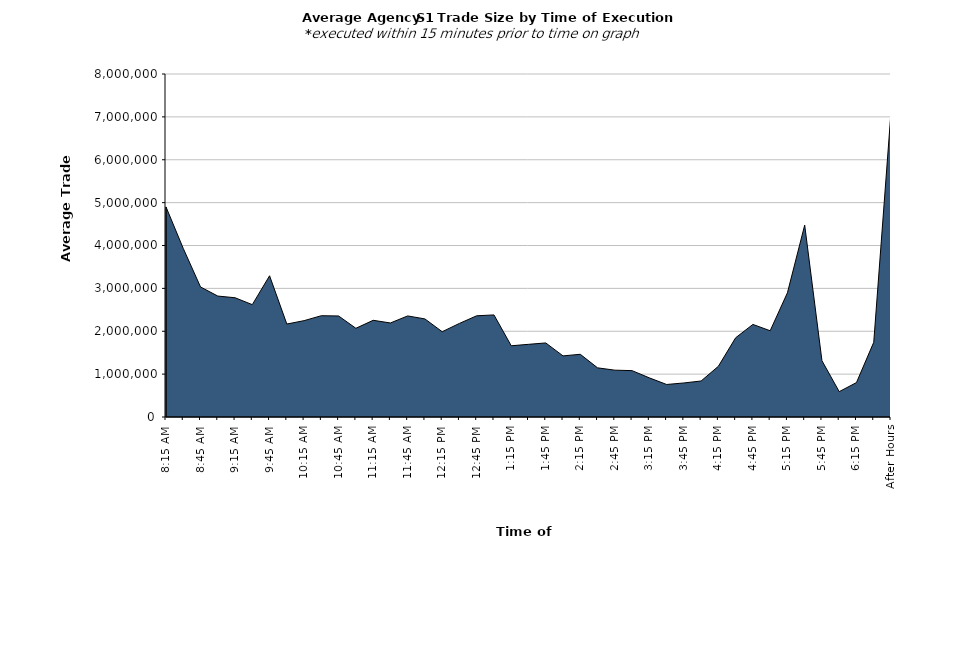
| Category | Series 0 |
|---|---|
| 8:15 AM | 4899503.876 |
| 8:30 AM | 3931654.894 |
| 8:45 AM | 3032856.536 |
| 9:00 AM | 2820884.991 |
| 9:15 AM | 2781494.517 |
| 9:30 AM | 2620276.479 |
| 9:45 AM | 3294053.852 |
| 10:00 AM | 2167734.56 |
| 10:15 AM | 2247660.635 |
| 10:30 AM | 2362520.566 |
| 10:45 AM | 2356332.572 |
| 11:00 AM | 2069184.677 |
| 11:15 AM | 2255373.594 |
| 11:30 AM | 2193113.832 |
| 11:45 AM | 2357229.589 |
| 12:00 PM | 2287565.408 |
| 12:15 PM | 1989296.255 |
| 12:30 PM | 2183191.846 |
| 12:45 PM | 2361018.642 |
| 1:00 PM | 2380668.255 |
| 1:15 PM | 1661282.897 |
| 1:30 PM | 1694673.297 |
| 1:45 PM | 1727414.87 |
| 2:00 PM | 1425319.067 |
| 2:15 PM | 1462532.325 |
| 2:30 PM | 1146663.352 |
| 2:45 PM | 1092351.795 |
| 3:00 PM | 1081545.044 |
| 3:15 PM | 912900.845 |
| 3:30 PM | 758591.707 |
| 3:45 PM | 794080.204 |
| 4:00 PM | 839721.306 |
| 4:15 PM | 1183105.606 |
| 4:30 PM | 1847684.658 |
| 4:45 PM | 2159594.282 |
| 5:00 PM | 2011735.436 |
| 5:15 PM | 2896954.111 |
| 5:30 PM | 4475104.456 |
| 5:45 PM | 1313566.068 |
| 6:00 PM | 591589.917 |
| 6:15 PM | 803100.789 |
| 6:30 PM | 1742430.84 |
| After Hours | 7120645.684 |